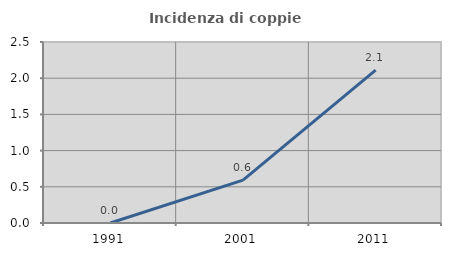
| Category | Incidenza di coppie miste |
|---|---|
| 1991.0 | 0 |
| 2001.0 | 0.592 |
| 2011.0 | 2.113 |